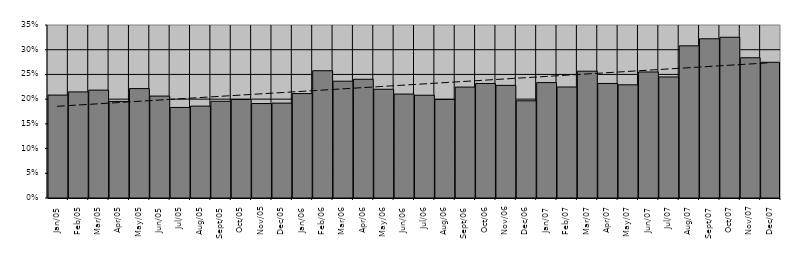
| Category | Series 0 |
|---|---|
| 2005-01-01 | 0.208 |
| 2005-02-01 | 0.215 |
| 2005-03-01 | 0.218 |
| 2005-04-01 | 0.195 |
| 2005-05-01 | 0.221 |
| 2005-06-01 | 0.206 |
| 2005-07-01 | 0.183 |
| 2005-08-01 | 0.186 |
| 2005-09-01 | 0.196 |
| 2005-10-01 | 0.199 |
| 2005-11-01 | 0.191 |
| 2005-12-01 | 0.192 |
| 2006-01-01 | 0.211 |
| 2006-02-01 | 0.257 |
| 2006-03-01 | 0.236 |
| 2006-04-01 | 0.24 |
| 2006-05-01 | 0.22 |
| 2006-06-01 | 0.21 |
| 2006-07-01 | 0.208 |
| 2006-08-01 | 0.199 |
| 2006-09-01 | 0.224 |
| 2006-10-01 | 0.232 |
| 2006-11-01 | 0.228 |
| 2006-12-01 | 0.197 |
| 2007-01-01 | 0.233 |
| 2007-02-01 | 0.225 |
| 2007-03-01 | 0.257 |
| 2007-04-01 | 0.232 |
| 2007-05-01 | 0.229 |
| 2007-06-01 | 0.255 |
| 2007-07-01 | 0.245 |
| 2007-08-01 | 0.308 |
| 2007-09-01 | 0.322 |
| 2007-10-01 | 0.325 |
| 2007-11-01 | 0.284 |
| 2007-12-01 | 0.275 |